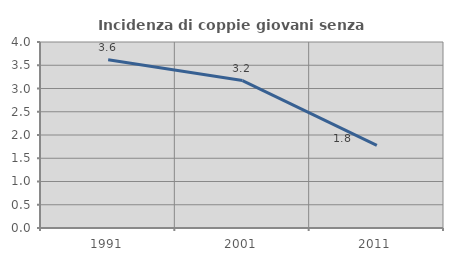
| Category | Incidenza di coppie giovani senza figli |
|---|---|
| 1991.0 | 3.62 |
| 2001.0 | 3.17 |
| 2011.0 | 1.779 |